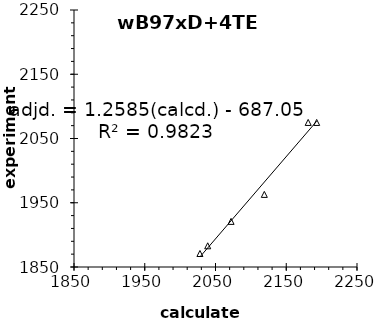
| Category | wB97xD |
|---|---|
| 2028.0 | 1871 |
| 2039.0 | 1883 |
| 2072.0 | 1921 |
| 2119.0 | 1963 |
| 2181.0 | 2075 |
| 2193.0 | 2075 |